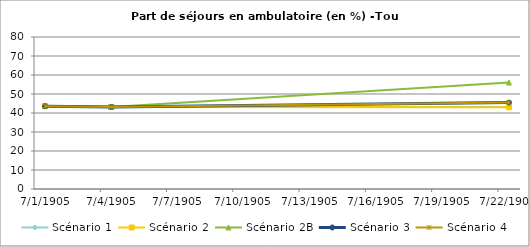
| Category | Scénario 1 | Scénario 2 | Scénario 2B | Scénario 3 | Scénario 4 |
|---|---|---|---|---|---|
| 2009.0 | 43.618 | 43.618 | 43.618 | 43.618 | 43.618 |
| 2012.0 | 43.189 | 43.189 | 43.189 | 43.189 | 43.189 |
| 2030.0 | 43.159 | 43.024 | 56.057 | 45.468 | 45.468 |